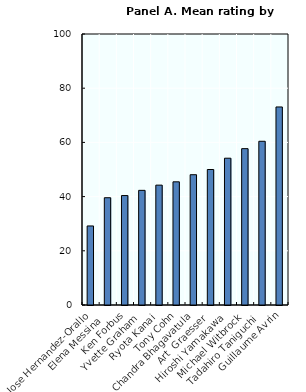
| Category | Mean score |
|---|---|
| Jose Hernandez-Orallo | 29.167 |
| Elena Messina  | 39.583 |
| Ken Forbus | 40.385 |
| Yvette Graham | 42.308 |
| Ryota Kanai  | 44.231 |
| Tony Cohn | 45.455 |
| Chandra Bhagavatula | 48.077 |
| Art  Graesser | 50 |
| Hiroshi Yamakawa | 54.167 |
| Michael Witbrock | 57.692 |
| Tadahiro Taniguchi | 60.417 |
| Guillaume Avrin | 73.077 |